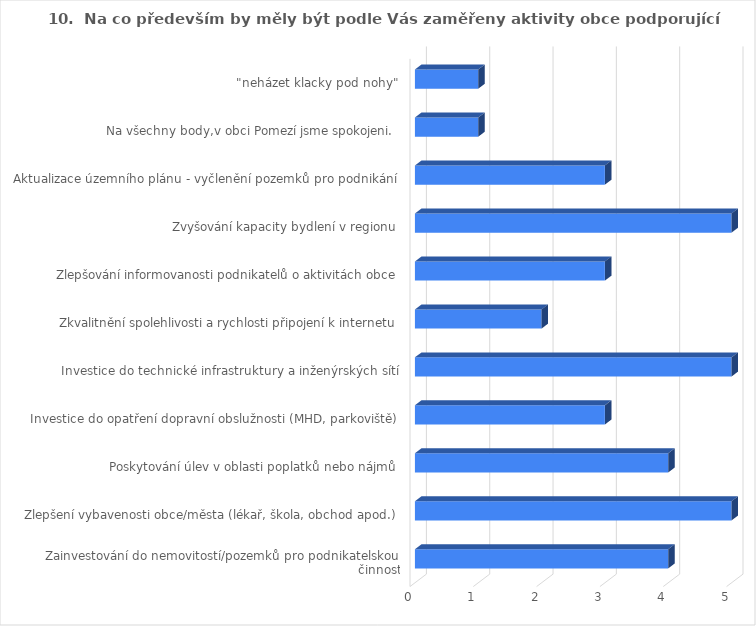
| Category | Series 0 |
|---|---|
| Zainvestování do nemovitostí/pozemků pro podnikatelskou činnost | 4 |
| Zlepšení vybavenosti obce/města (lékař, škola, obchod apod.) | 5 |
| Poskytování úlev v oblasti poplatků nebo nájmů | 4 |
| Investice do opatření dopravní obslužnosti (MHD, parkoviště) | 3 |
| Investice do technické infrastruktury a inženýrských sítí | 5 |
| Zkvalitnění spolehlivosti a rychlosti připojení k internetu | 2 |
| Zlepšování informovanosti podnikatelů o aktivitách obce | 3 |
| Zvyšování kapacity bydlení v regionu | 5 |
| Aktualizace územního plánu - vyčlenění pozemků pro podnikání | 3 |
| Na všechny body,v obci Pomezí jsme spokojeni.  | 1 |
| "neházet klacky pod nohy" | 1 |